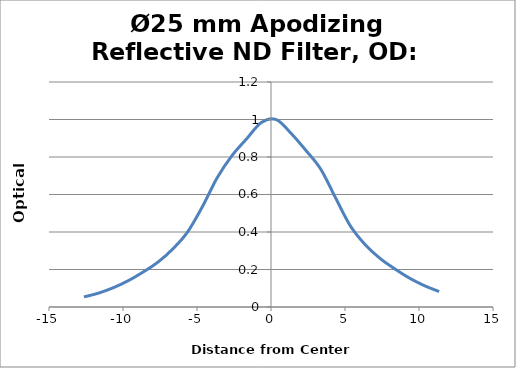
| Category | Optical Density |
|---|---|
| -12.64 | 0.054 |
| -11.64 | 0.074 |
| -10.64 | 0.103 |
| -9.64 | 0.14 |
| -8.64 | 0.186 |
| -7.64 | 0.239 |
| -6.64 | 0.309 |
| -5.64 | 0.4 |
| -4.64 | 0.534 |
| -3.64 | 0.689 |
| -2.64 | 0.807 |
| -1.64 | 0.898 |
| -0.64 | 0.985 |
| 0.36 | 0.999 |
| 1.36 | 0.926 |
| 2.36 | 0.835 |
| 3.36 | 0.735 |
| 4.36 | 0.583 |
| 5.36 | 0.433 |
| 6.36 | 0.333 |
| 7.36 | 0.26 |
| 8.36 | 0.204 |
| 9.36 | 0.154 |
| 10.36 | 0.114 |
| 11.36 | 0.082 |